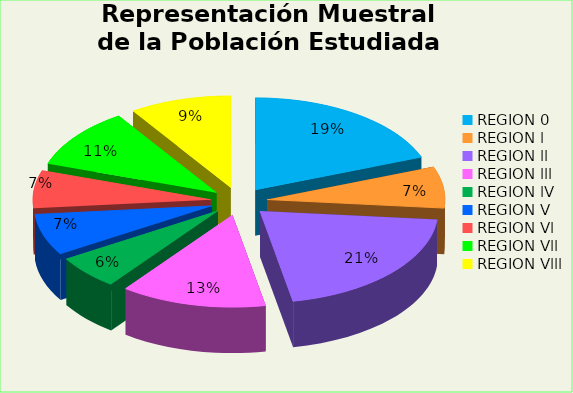
| Category | Series 0 | Series 1 |
|---|---|---|
| REGION 0 | 29 | 0.21 |
| REGION l | 11 | 0.073 |
| REGION ll | 31 | 0.205 |
| REGION lll | 20 | 0.132 |
| REGION lV | 9 | 0.06 |
| REGION V | 11 | 0.073 |
| REGION Vl | 10 | 0.066 |
| REGION Vll | 16 | 0.106 |
| REGION Vlll | 14 | 0.093 |